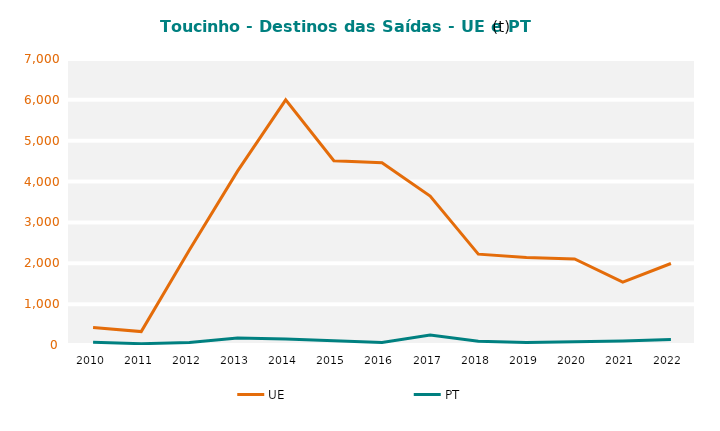
| Category | UE | PT |
|---|---|---|
| 2010.0 | 427.25 | 64.72 |
| 2011.0 | 328.608 | 31.987 |
| 2012.0 | 2324.576 | 61.771 |
| 2013.0 | 4254.602 | 170.122 |
| 2014.0 | 6001.436 | 147.716 |
| 2015.0 | 4511.118 | 104.656 |
| 2016.0 | 4460.5 | 62.214 |
| 2017.0 | 3644.218 | 241.486 |
| 2018.0 | 2223.554 | 90.713 |
| 2019.0 | 2140.341 | 62.465 |
| 2020.0 | 2105.147 | 77.353 |
| 2021.0 | 1539.861 | 96.233 |
| 2022.0 | 1994.571 | 135.222 |